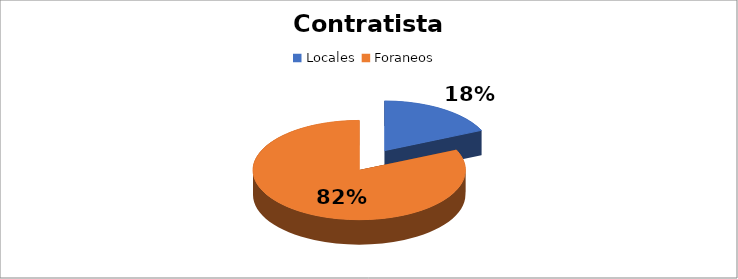
| Category | Suma |
|---|---|
| Locales  | 702419.81 |
| Foraneos  | 3136505.05 |